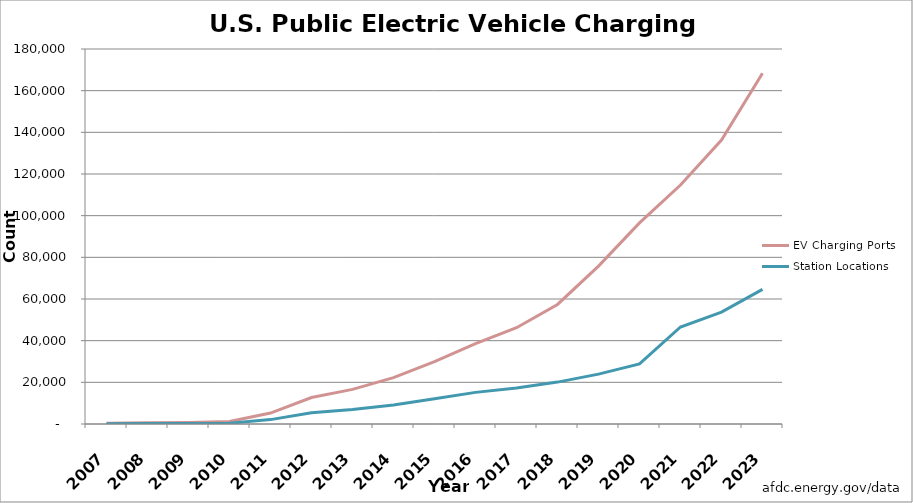
| Category |  EV Charging Ports  |  Station Locations  |
|---|---|---|
| 2007.0 | 417 | 139 |
| 2008.0 | 564 | 196 |
| 2009.0 | 771 | 259 |
| 2010.0 | 1256 | 407 |
| 2011.0 | 5248 | 2109 |
| 2012.0 | 12726 | 5444 |
| 2013.0 | 16619 | 6938 |
| 2014.0 | 22247 | 9110 |
| 2015.0 | 29968 | 12128 |
| 2016.0 | 38543 | 15182 |
| 2017.0 | 46218 | 17314 |
| 2018.0 | 57386 | 20110 |
| 2019.0 | 75808 | 23951 |
| 2020.0 | 96521 | 28851 |
| 2021.0 | 114715 | 46558 |
| 2022.0 | 136307 | 53693 |
| 2023.0 | 168388 | 64641 |